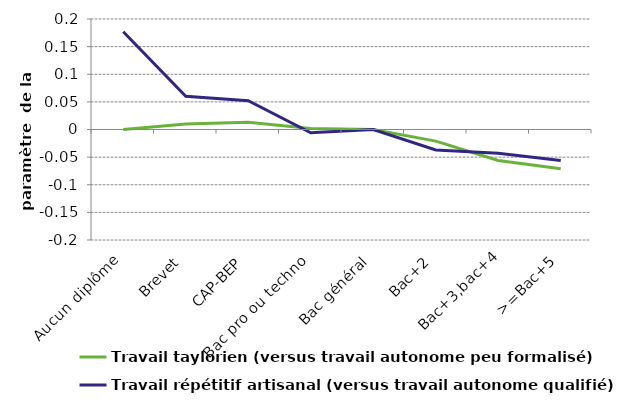
| Category | Travail taylorien (versus travail autonome peu formalisé) | Travail répétitif artisanal (versus travail autonome qualifié) |
|---|---|---|
| Aucun diplôme | 0 | 0.177 |
| Brevet | 0.01 | 0.06 |
| CAP-BEP | 0.013 | 0.052 |
| Bac pro ou techno | 0.002 | -0.006 |
| Bac général | 0 | 0 |
| Bac+2 | -0.021 | -0.037 |
| Bac+3,bac+4 | -0.056 | -0.043 |
| >=Bac+5 | -0.071 | -0.056 |